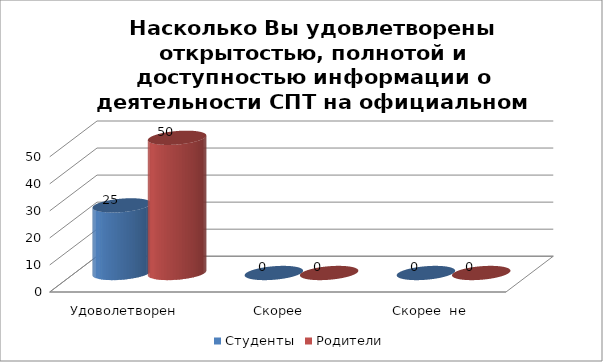
| Category | Студенты | Родители |
|---|---|---|
| Удоволетворен | 25 | 50 |
| Скорее удовлетворен | 0 | 0 |
| Скорее  не удовлетворен | 0 | 0 |